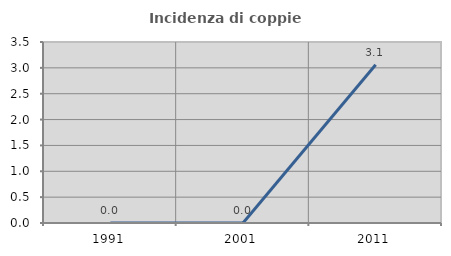
| Category | Incidenza di coppie miste |
|---|---|
| 1991.0 | 0 |
| 2001.0 | 0 |
| 2011.0 | 3.061 |